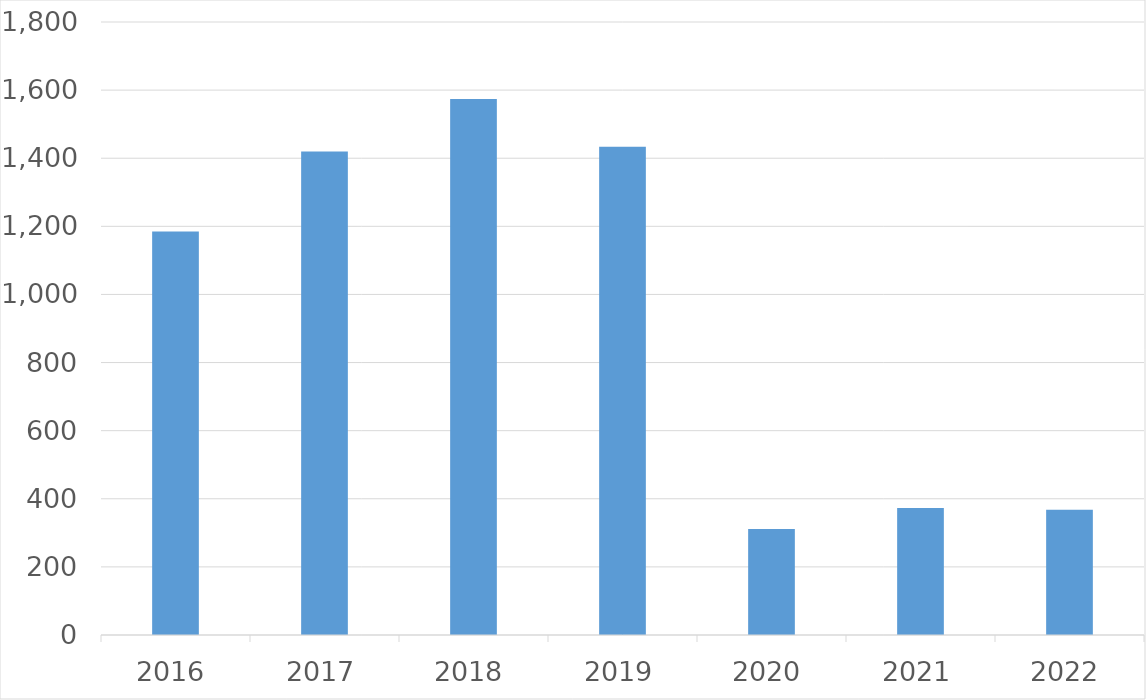
| Category | Series 0 |
|---|---|
| 2016 | 1185 |
| 2017 | 1420 |
| 2018 | 1574 |
| 2019 | 1434 |
| 2020 | 311 |
| 2021 | 373 |
| 2022 | 368 |